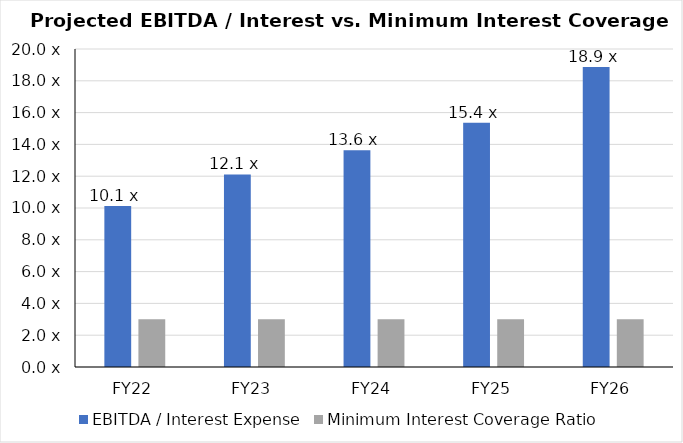
| Category | EBITDA / Interest Expense | Minimum Interest Coverage Ratio |
|---|---|---|
| 2022-12-31 | 10.12 | 3 |
| 2023-12-31 | 12.111 | 3 |
| 2024-12-31 | 13.631 | 3 |
| 2025-12-31 | 15.368 | 3 |
| 2026-12-31 | 18.861 | 3 |